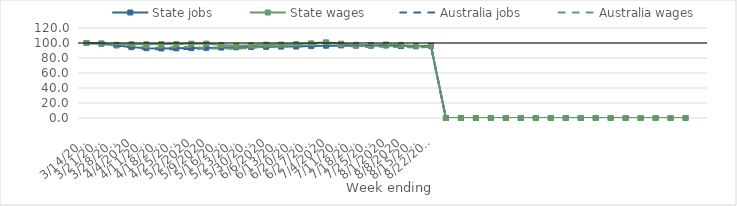
| Category | State jobs | State wages | Australia jobs | Australia wages |
|---|---|---|---|---|
| 14/03/2020 | 100 | 100 | 100 | 100 |
| 21/03/2020 | 99.338 | 98.789 | 99.297 | 99.676 |
| 28/03/2020 | 96.765 | 97.669 | 96.353 | 98.41 |
| 04/04/2020 | 94.495 | 98.344 | 93.695 | 96.734 |
| 11/04/2020 | 93.105 | 98.279 | 91.951 | 94.156 |
| 18/04/2020 | 92.699 | 98.536 | 91.482 | 94.08 |
| 25/04/2020 | 92.872 | 98.55 | 91.798 | 94.248 |
| 02/05/2020 | 93.205 | 99.113 | 92.191 | 94.724 |
| 09/05/2020 | 93.467 | 99.219 | 92.737 | 93.356 |
| 16/05/2020 | 93.921 | 97.249 | 93.262 | 92.686 |
| 23/05/2020 | 94.414 | 96.337 | 93.563 | 92.308 |
| 30/05/2020 | 94.609 | 96.894 | 94.077 | 93.6 |
| 06/06/2020 | 94.937 | 97.852 | 95.016 | 95.393 |
| 13/06/2020 | 95.179 | 97.857 | 95.489 | 96.094 |
| 20/06/2020 | 95.341 | 98.431 | 95.696 | 96.969 |
| 27/06/2020 | 95.848 | 99.562 | 95.581 | 96.996 |
| 04/07/2020 | 96.393 | 100.92 | 96.174 | 98.514 |
| 11/07/2020 | 96.832 | 99.1 | 96.395 | 95.769 |
| 18/07/2020 | 96.46 | 97.553 | 96.226 | 95.048 |
| 25/07/2020 | 96.409 | 97.054 | 96.271 | 94.643 |
| 01/08/2020 | 96.627 | 98.04 | 96.155 | 94.947 |
| 08/08/2020 | 95.906 | 97.459 | 95.543 | 94.567 |
| 15/08/2020 | 95.635 | 96.137 | 95.204 | 94.097 |
| 22/08/2020 | 96.011 | 96.467 | 95.812 | 94.778 |